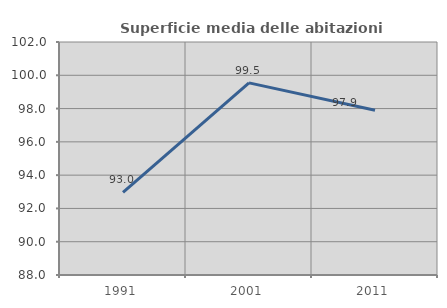
| Category | Superficie media delle abitazioni occupate |
|---|---|
| 1991.0 | 92.958 |
| 2001.0 | 99.544 |
| 2011.0 | 97.898 |